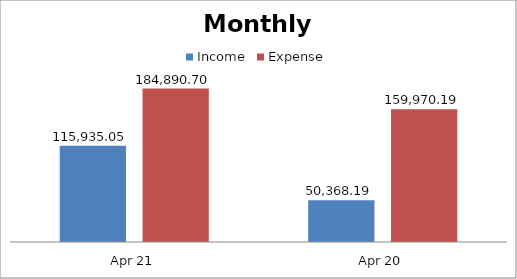
| Category | Income | Expense |
|---|---|---|
| Apr 21 | 115935.05 | 184890.7 |
| Apr 20 | 50368.19 | 159970.19 |